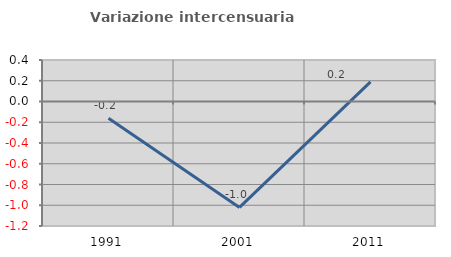
| Category | Variazione intercensuaria annua |
|---|---|
| 1991.0 | -0.161 |
| 2001.0 | -1.021 |
| 2011.0 | 0.189 |